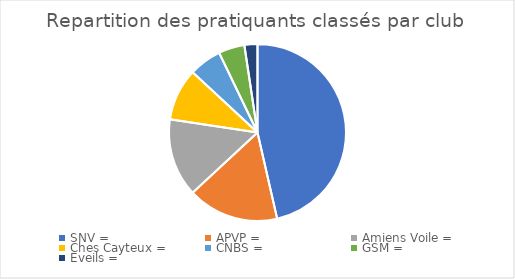
| Category | Series 0 |
|---|---|
| SNV = | 39 |
| APVP = | 14 |
| Amiens Voile = | 12 |
| Ches Cayteux = | 8 |
| CNBS = | 5 |
| GSM = | 4 |
| Eveils = | 2 |